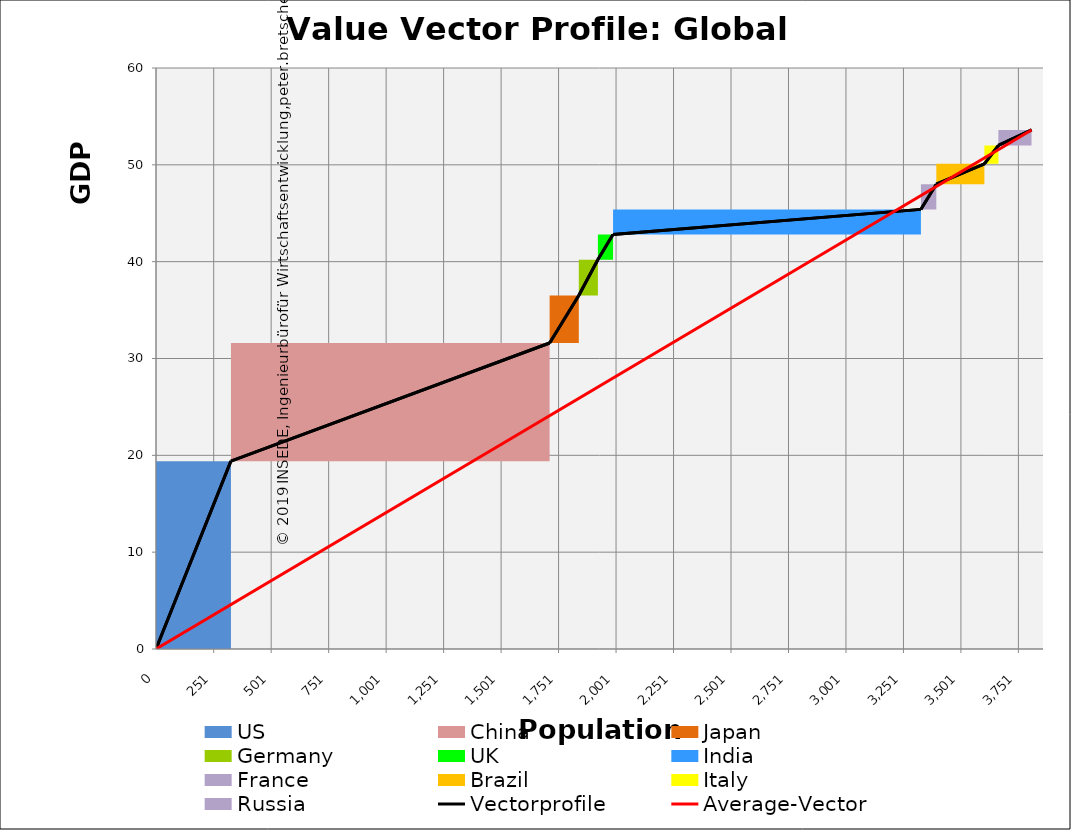
| Category | transparent | US | China | Japan | Germany | UK | India | France | Brazil | Italy | Russia | Border right & top |
|---|---|---|---|---|---|---|---|---|---|---|---|---|
| 0.0 | 0 | 19.4 | 0 | 0 | 0 | 0 | 0 | 0 | 0 | 0 | 0 | 0 |
| 325.7 | 0 | 19.4 | 0 | 0 | 0 | 0 | 0 | 0 | 0 | 0 | 0 | 0 |
| 325.7 | 19.4 | 0 | 12.2 | 0 | 0 | 0 | 0 | 0 | 0 | 0 | 0 | 0 |
| 1712.1000000000001 | 19.4 | 0 | 12.2 | 0 | 0 | 0 | 0 | 0 | 0 | 0 | 0 | 0 |
| 1712.1000000000001 | 31.6 | 0 | 0 | 4.9 | 0 | 0 | 0 | 0 | 0 | 0 | 0 | 0 |
| 1838.9 | 31.6 | 0 | 0 | 4.9 | 0 | 0 | 0 | 0 | 0 | 0 | 0 | 0 |
| 1838.9 | 36.5 | 0 | 0 | 0 | 3.7 | 0 | 0 | 0 | 0 | 0 | 0 | 0 |
| 1921.6000000000001 | 36.5 | 0 | 0 | 0 | 3.7 | 0 | 0 | 0 | 0 | 0 | 0 | 0 |
| 1921.6000000000001 | 40.2 | 0 | 0 | 0 | 0 | 2.6 | 0 | 0 | 0 | 0 | 0 | 0 |
| 1987.6000000000001 | 40.2 | 0 | 0 | 0 | 0 | 2.6 | 0 | 0 | 0 | 0 | 0 | 0 |
| 1987.6000000000001 | 42.8 | 0 | 0 | 0 | 0 | 0 | 2.6 | 0 | 0 | 0 | 0 | 0 |
| 3326.8 | 42.8 | 0 | 0 | 0 | 0 | 0 | 2.6 | 0 | 0 | 0 | 0 | 0 |
| 3326.8 | 45.4 | 0 | 0 | 0 | 0 | 0 | 0 | 2.6 | 0 | 0 | 0 | 0 |
| 3393.9 | 45.4 | 0 | 0 | 0 | 0 | 0 | 0 | 2.6 | 0 | 0 | 0 | 0 |
| 3393.9 | 48 | 0 | 0 | 0 | 0 | 0 | 0 | 0 | 2.1 | 0 | 0 | 0 |
| 3603.2000000000003 | 48 | 0 | 0 | 0 | 0 | 0 | 0 | 0 | 2.1 | 0 | 0 | 0 |
| 3603.2000000000003 | 50.1 | 0 | 0 | 0 | 0 | 0 | 0 | 0 | 0 | 1.9 | 0 | 0 |
| 3663.8 | 50.1 | 0 | 0 | 0 | 0 | 0 | 0 | 0 | 0 | 1.9 | 0 | 0 |
| 3663.8 | 52 | 0 | 0 | 0 | 0 | 0 | 0 | 0 | 0 | 0 | 1.6 | 0 |
| 3808.3 | 52 | 0 | 0 | 0 | 0 | 0 | 0 | 0 | 0 | 0 | 1.6 | 0 |
| 3808.3 | 53.6 | 0 | 0 | 0 | 0 | 0 | 0 | 0 | 0 | 0 | 0 | 0 |
| 3858.3 | 53.6 | 0 | 0 | 0 | 0 | 0 | 0 | 0 | 0 | 0 | 0 | 0 |
| 3858.3 | 53.6 | 0 | 0 | 0 | 0 | 0 | 0 | 0 | 0 | 0 | 0 | 0 |